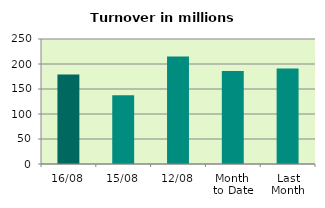
| Category | Series 0 |
|---|---|
| 16/08 | 178.965 |
| 15/08 | 137.445 |
| 12/08 | 214.963 |
| Month 
to Date | 186.197 |
| Last
Month | 191.038 |